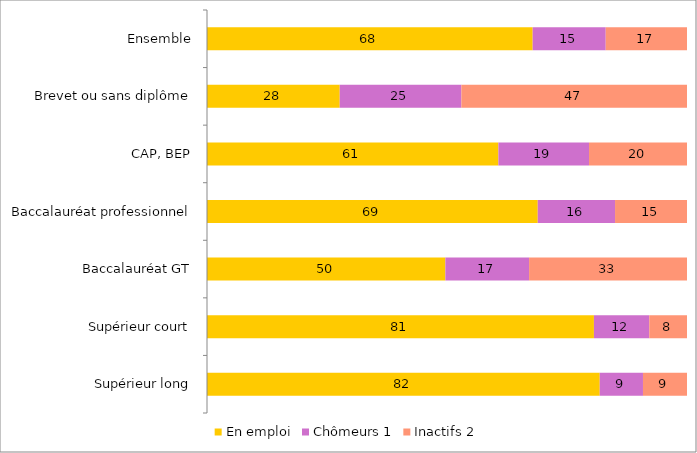
| Category | En emploi | Chômeurs 1 | Inactifs 2 |
|---|---|---|---|
| Supérieur long | 81.82 | 9.01 | 9.17 |
| Supérieur court | 80.61 | 11.53 | 7.86 |
| Baccalauréat GT | 49.66 | 17.44 | 32.9 |
| Baccalauréat professionnel | 68.9 | 16.1 | 14.99 |
| CAP, BEP | 60.7 | 18.88 | 20.41 |
| Brevet ou sans diplôme | 27.65 | 25.34 | 47 |
| Ensemble | 67.85 | 15.22 | 16.93 |